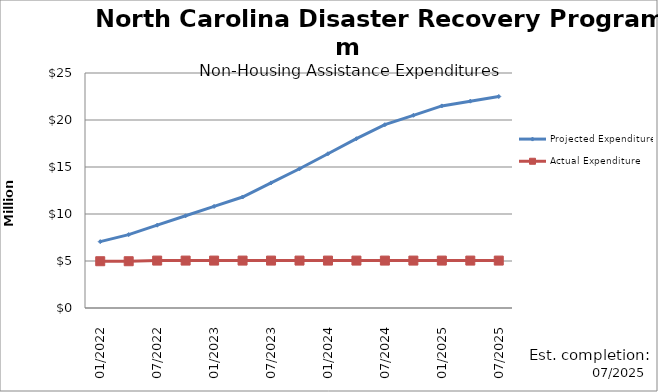
| Category | Projected Expenditures | Actual Expenditure |
|---|---|---|
| 01/2022 | 7059985 | 4975185.9 |
| 4/2022 | 7809985 | 4975185.9 |
| 07/2022 | 8809985 | 5043223.84 |
| 10/2022 | 9809985 | 5043223.84 |
| 01/2023 | 10809985 | 5043223.84 |
| 4/2023 | 11809985 | 5043223.84 |
| 07/2023 | 13309985 | 5043223.84 |
| 10/2023 | 14809985 | 5043223.84 |
| 01/2024 | 16409985 | 5043223.84 |
| 4/2024 | 18009985 | 5043223.84 |
| 07/2024 | 19500000 | 5043223.84 |
| 10/2024 | 20500000 | 5043223.84 |
| 01/2025 | 21500000 | 5043223.84 |
| 4/2025 | 22000000 | 5043223.84 |
| 07/2025 | 22500000 | 5043223.84 |